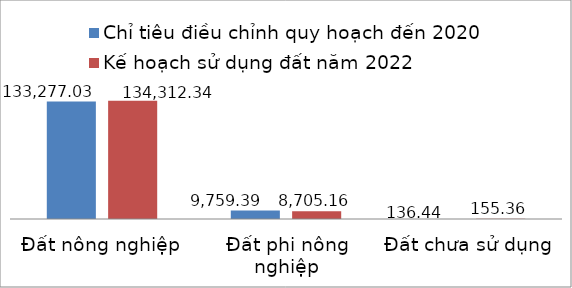
| Category | Chỉ tiêu điều chỉnh quy hoạch đến 2020 | Kế hoạch sử dụng đất năm 2022 |
|---|---|---|
| Đất nông nghiệp | 133277.03 | 134312.34 |
| Đất phi nông nghiệp | 9759.39 | 8705.16 |
| Đất chưa sử dụng | 136.44 | 155.36 |